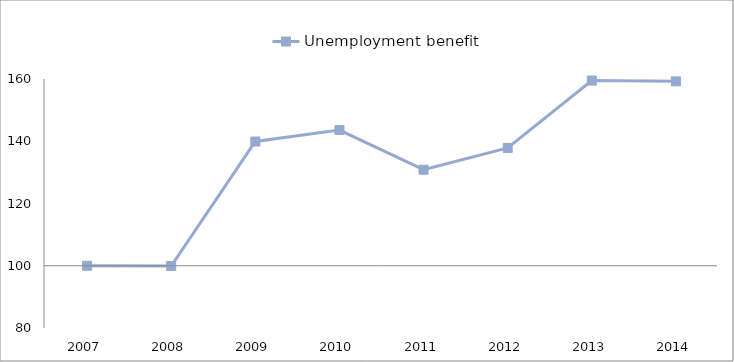
| Category | Unemployment benefit  | 0 |
|---|---|---|
| 2007.0 | 100 |  |
| 2008.0 | 99.916 |  |
| 2009.0 | 139.916 |  |
| 2010.0 | 143.596 |  |
| 2011.0 | 130.852 |  |
| 2012.0 | 137.834 |  |
| 2013.0 | 159.495 |  |
| 2014.0 | 159.243 |  |